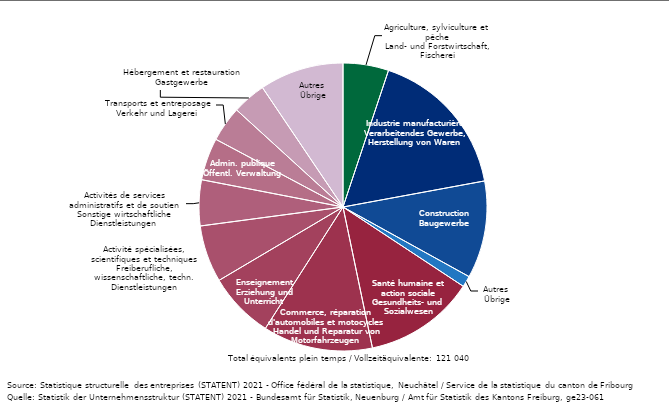
| Category | branches |
|---|---|
| Agriculture, sylviculture et pêche
Land- und Forstwirtschaft, Fischerei | 6195.185 |
| Industrie manufacturière
Verarbeitendes Gewerbe, Herstellung von Waren  | 20557.081 |
| Construction
Baugewerbe | 13227.709 |
| Autres 
Übrige | 1507.503 |
| Santé humaine et 
action sociale
Gesundheits- und 
Sozialwesen | 15062.786 |
| Commerce, réparation d'automobiles et motocycles
Handel und Reparatur von Motorfahrzeugen | 14925.803 |
| Enseignement
Erziehung und
Unterricht | 9007.914 |
| Activité spécialisées, scientifiques et techniques
Freiberufliche, wissenschaftliche, techn. Dienstleistungen | 7744.281 |
| Activités de services administratifs et de soutien 
Sonstige wirtschaftliche Dienstleistungen  | 6226.862 |
| Admin. publique
Öffentl. Verwaltung | 5747.261 |
| Transports et entreposage
Verkehr und Lagerei  | 4825.524 |
| Hébergement et restauration
Gastgewerbe | 4580.362 |
| Autres 
Übrige | 11432.023 |